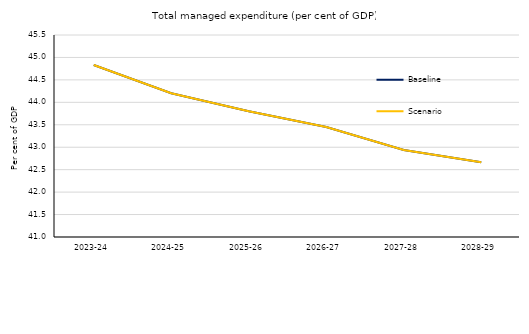
| Category | Baseline | Scenario |
|---|---|---|
| 2023-24 | 44.832 | 44.832 |
| 2024-25 | 44.203 | 44.203 |
| 2025-26 | 43.8 | 43.8 |
| 2026-27 | 43.449 | 43.449 |
| 2027-28 | 42.938 | 42.938 |
| 2028-29 | 42.665 | 42.665 |